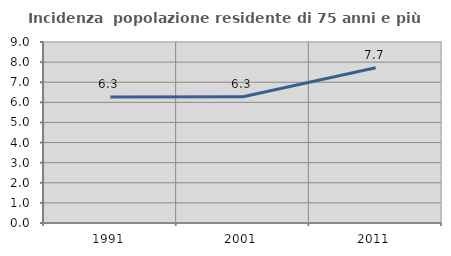
| Category | Incidenza  popolazione residente di 75 anni e più |
|---|---|
| 1991.0 | 6.262 |
| 2001.0 | 6.278 |
| 2011.0 | 7.716 |